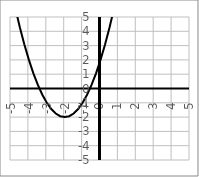
| Category | y |
|---|---|
| -5.0 | 7 |
| -4.75 | 5.562 |
| -4.5 | 4.25 |
| -4.25 | 3.062 |
| -4.0 | 2 |
| -3.75 | 1.062 |
| -3.5 | 0.25 |
| -3.25 | -0.438 |
| -3.0 | -1 |
| -2.75 | -1.438 |
| -2.5 | -1.75 |
| -2.25 | -1.938 |
| -2.0 | -2 |
| -1.75 | -1.938 |
| -1.5 | -1.75 |
| -1.25 | -1.438 |
| -1.0 | -1 |
| -0.75 | -0.438 |
| -0.5 | 0.25 |
| -0.25 | 1.062 |
| 0.0 | 2 |
| 0.25 | 3.062 |
| 0.5 | 4.25 |
| 0.75 | 5.562 |
| 1.0 | 7 |
| 1.25 | 8.562 |
| 1.5 | 10.25 |
| 1.75 | 12.062 |
| 2.0 | 14 |
| 2.25 | 16.062 |
| 2.5 | 18.25 |
| 2.75 | 20.562 |
| 3.0 | 23 |
| 3.25 | 25.562 |
| 3.5 | 28.25 |
| 3.75 | 31.062 |
| 4.0 | 34 |
| 4.25 | 37.062 |
| 4.5 | 40.25 |
| 4.75 | 43.562 |
| 5.0 | 47 |